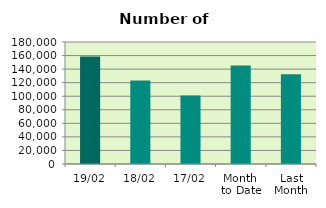
| Category | Series 0 |
|---|---|
| 19/02 | 158738 |
| 18/02 | 123166 |
| 17/02 | 101218 |
| Month 
to Date | 145424.923 |
| Last
Month | 132423.636 |